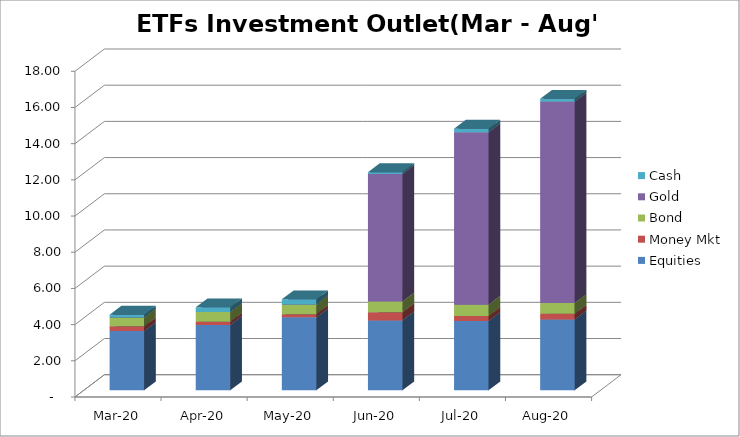
| Category | Equities | Money Mkt | Bond | Gold | Cash |
|---|---|---|---|---|---|
| 2020-03-01 | 3274342665.32 | 259460908.27 | 495910824.65 | 0 | 150095912.89 |
| 2020-04-01 | 3614392230.14 | 175752553.41 | 535087967.52 | 0 | 260113227.03 |
| 2020-05-01 | 4032265012.12 | 177070409.49 | 538903891.86 | 0 | 278503239.37 |
| 2020-06-01 | 3864587279.22 | 452492408.13 | 591048061.03 | 7051738147.24 | 93622092.4 |
| 2020-07-01 | 3831828644.68 | 272103487.34 | 625862830.11 | 9533055643.75 | 191169576.23 |
| 2020-08-01 | 3913723749.54 | 316071867.88 | 592621089.37 | 11135395115.33 | 152002086.71 |